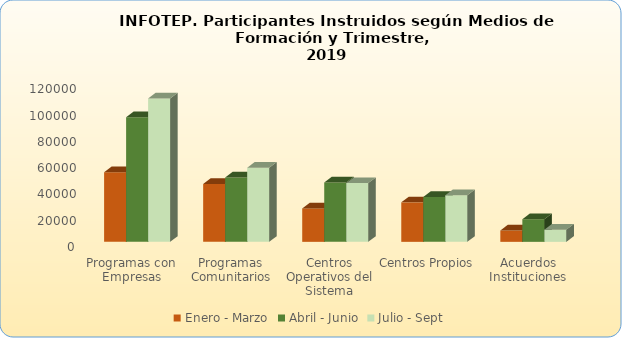
| Category | Enero - Marzo | Abril - Junio | Julio - Sept |
|---|---|---|---|
| Programas con Empresas | 53026 | 94785 | 109015 |
| Programas Comunitarios | 44087 | 49035 | 56317 |
| Centros Operativos del Sistema | 25416 | 45145 | 44708 |
| Centros Propios | 30031 | 34153 | 35451 |
| Acuerdos Instituciones | 8615 | 17208 | 9294 |